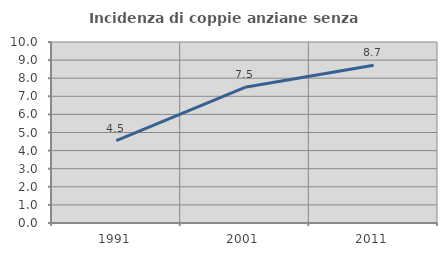
| Category | Incidenza di coppie anziane senza figli  |
|---|---|
| 1991.0 | 4.545 |
| 2001.0 | 7.495 |
| 2011.0 | 8.718 |